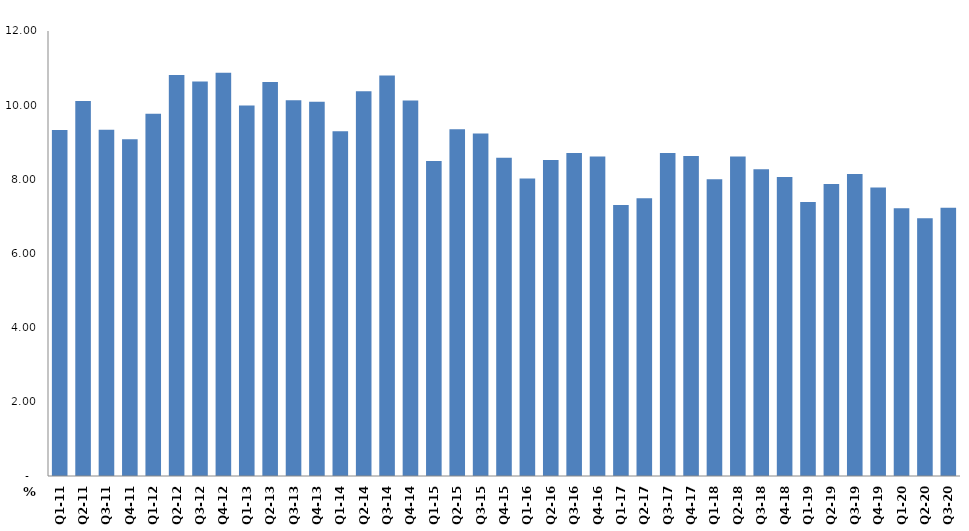
| Category | النسبة المئوية من الناتج المحلي الاجمالي
Percent of Total GDP |
|---|---|
| Q1-11 | 9.33 |
| Q2-11 | 10.111 |
| Q3-11 | 9.338 |
| Q4-11 | 9.081 |
| Q1-12 | 9.769 |
| Q2-12 | 10.813 |
| Q3-12 | 10.635 |
| Q4-12 | 10.877 |
| Q1-13 | 9.99 |
| Q2-13 | 10.622 |
| Q3-13 | 10.133 |
| Q4-13 | 10.095 |
| Q1-14 | 9.298 |
| Q2-14 | 10.378 |
| Q3-14 | 10.803 |
| Q4-14 | 10.123 |
| Q1-15 | 8.498 |
| Q2-15 | 9.348 |
| Q3-15 | 9.236 |
| Q4-15 | 8.58 |
| Q1-16 | 8.023 |
| Q2-16 | 8.521 |
| Q3-16 | 8.711 |
| Q4-16 | 8.614 |
| Q1-17 | 7.308 |
| Q2-17 | 7.491 |
| Q3-17 | 8.71 |
| Q4-17 | 8.632 |
| Q1-18 | 8.005 |
| Q2-18 | 8.616 |
| Q3-18 | 8.272 |
| Q4-18 | 8.061 |
| Q1-19 | 7.388 |
| Q2-19 | 7.872 |
| Q3-19 | 8.143 |
| Q4-19 | 7.779 |
| Q1-20 | 7.222 |
| Q2-20 | 6.954 |
| Q3-20 | 7.231 |